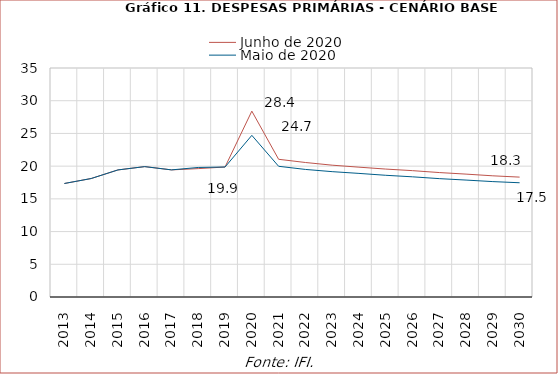
| Category | Junho de 2020 | Maio de 2020 |
|---|---|---|
| 2013.0 | 17.348 | 17.348 |
| 2014.0 | 18.109 | 18.109 |
| 2015.0 | 19.421 | 19.421 |
| 2016.0 | 19.929 | 19.929 |
| 2017.0 | 19.428 | 19.428 |
| 2018.0 | 19.621 | 19.798 |
| 2019.0 | 19.869 | 19.869 |
| 2020.0 | 28.408 | 24.707 |
| 2021.0 | 21.048 | 19.978 |
| 2022.0 | 20.558 | 19.497 |
| 2023.0 | 20.146 | 19.158 |
| 2024.0 | 19.845 | 18.891 |
| 2025.0 | 19.553 | 18.603 |
| 2026.0 | 19.312 | 18.369 |
| 2027.0 | 19.021 | 18.092 |
| 2028.0 | 18.781 | 17.872 |
| 2029.0 | 18.52 | 17.637 |
| 2030.0 | 18.323 | 17.461 |